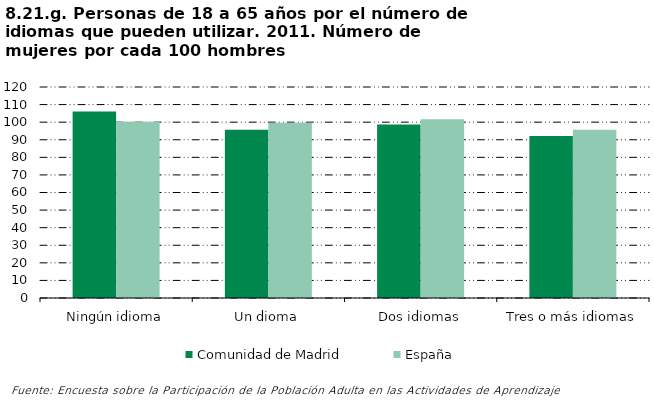
| Category | Comunidad de Madrid | España |
|---|---|---|
| Ningún idioma | 106.008 | 100.212 |
| Un dioma | 95.745 | 99.655 |
| Dos idiomas | 98.683 | 101.649 |
| Tres o más idiomas | 92.067 | 95.69 |